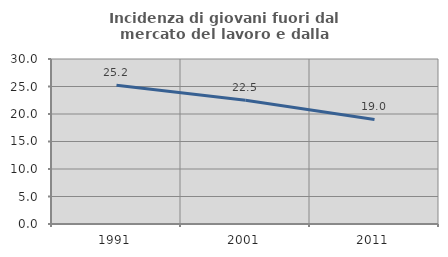
| Category | Incidenza di giovani fuori dal mercato del lavoro e dalla formazione  |
|---|---|
| 1991.0 | 25.243 |
| 2001.0 | 22.481 |
| 2011.0 | 19.005 |